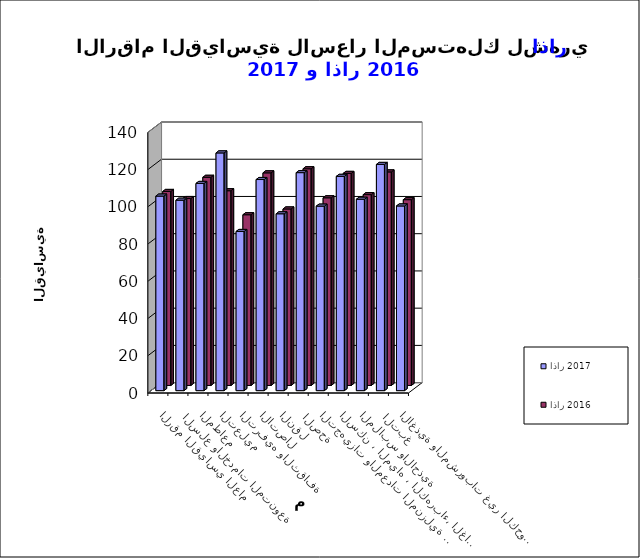
| Category | اذار 2017      | اذار 2016 |
|---|---|---|
| الاغذية والمشروبات غير الكحولية | 99.2 | 99.8 |
|  التبغ | 121.5 | 114.7 |
| الملابس والاحذية | 102.8 | 102.5 |
| السكن ، المياه ، الكهرباء، الغاز  | 115.1 | 113.9 |
| التجهيزات والمعدات المنزلية والصيانة | 99.1 | 100.8 |
|  الصحة | 117.1 | 116.4 |
| النقل | 95 | 94.8 |
| الاتصال | 113.4 | 114.2 |
| الترفيه والثقافة | 85.5 | 91.7 |
| التعليم | 127.7 | 104.6 |
| المطاعم  | 111.3 | 111.8 |
|  السلع والخدمات المتنوعة | 102.3 | 100.4 |
| الرقم القياسي العام | 104.5 | 104.2 |